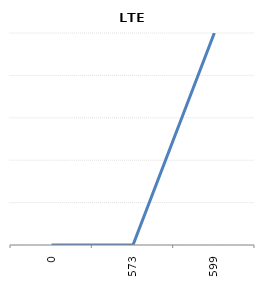
| Category | LTE |
|---|---|
| 0.0 | 0 |
| 573.0 | 0 |
| 599.0 | 1 |